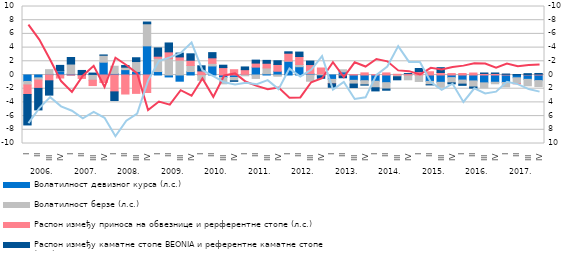
| Category | Волатилност девизног курса (л.с.) | Волатилност берзе (л.с.) | Распон између приноса на обвезнице и рерферентне стопе (л.с.) | Распон између каматне стопе BEONIA и референтне каматне стопе (л.с.) |
|---|---|---|---|---|
| 0 | -0.942 | -0.513 | -1.394 | -4.443 |
| 1 | -0.416 | -0.323 | -1.217 | -3.139 |
| 2 | 0.134 | 0.644 | -0.848 | -2.088 |
| 3 | 0.596 | 0.047 | -0.442 | 0.76 |
| 4 | 0.185 | 1.416 | -0.022 | 0.954 |
| 5 | 0.044 | 0 | -0.498 | 0.62 |
| 6 | 0.098 | -0.766 | -0.776 | 0.183 |
| 7 | 1.867 | 1.014 | -1.096 | 0.042 |
| 8 | 0.224 | 1.058 | -2.463 | -1.265 |
| 9 | 0.784 | 0.357 | -2.776 | 0.24 |
| 10 | 0.516 | 1.449 | -2.682 | 0.553 |
| 11 | 4.254 | 3.223 | -2.553 | 0.257 |
| 12 | 0.512 | 1.936 | 0.296 | 1.209 |
| 13 | -0.282 | 2.392 | 0.987 | 1.297 |
| 14 | -0.903 | 2.163 | 0.479 | 0.556 |
| 15 | 0.501 | 0.885 | 0.769 | 0.938 |
| 16 | 0.058 | -0.772 | 0.542 | 0.741 |
| 17 | 1.32 | 0.379 | 0.81 | 0.756 |
| 18 | -0.374 | -0.919 | 1.085 | 0.345 |
| 19 | -0.363 | -0.482 | 0.772 | -0.083 |
| 20 | 0.097 | -0.112 | 0.682 | 0.396 |
| 21 | 1.152 | -0.504 | 0.585 | 0.435 |
| 22 | 0.175 | 0.853 | 0.686 | 0.42 |
| 23 | 0.548 | -0.181 | 0.99 | 0.546 |
| 24 | 2.01 | 0.038 | 1.133 | 0.207 |
| 25 | 1.209 | 0.324 | 1.167 | 0.646 |
| 26 | 0.206 | -0.905 | 1.316 | 0.51 |
| 27 | -0.154 | 0.171 | 0.853 | -0.328 |
| 28 | -0.641 | -0.608 | -0.031 | -0.509 |
| 29 | 0.448 | 0.317 | -0.125 | -0.28 |
| 30 | -0.779 | -0.543 | 0.055 | -0.514 |
| 31 | -0.832 | -0.607 | 0.31 | -0.037 |
| 32 | -0.91 | -0.951 | 0.064 | -0.462 |
| 33 | -1.119 | -0.926 | 0.304 | -0.178 |
| 34 | -0.022 | -0.234 | 0.103 | -0.446 |
| 35 | -0.038 | -0.658 | 0.205 | 0.005 |
| 36 | -0.004 | -0.941 | 0.495 | 0.452 |
| 37 | -0.936 | -0.479 | 0.472 | -0.027 |
| 38 | -1.07 | -0.734 | 0.363 | 0.705 |
| 39 | -0.381 | -0.763 | 0.208 | -0.147 |
| 40 | -0.742 | -0.594 | 0.217 | -0.177 |
| 41 | -0.866 | -0.891 | 0.288 | -0.161 |
| 42 | -1.147 | -0.733 | 0.224 | 0.066 |
| 43 | -1.062 | -0.217 | 0.224 | 0.069 |
| 44 | -1.097 | -0.642 | 0.095 | 0.042 |
| 45 | -0.408 | -0.855 | -0.021 | 0.077 |
| 46 | -0.635 | -0.938 | 0.048 | 0.149 |
| 47 | -0.817 | -0.875 | 0.117 | 0.107 |